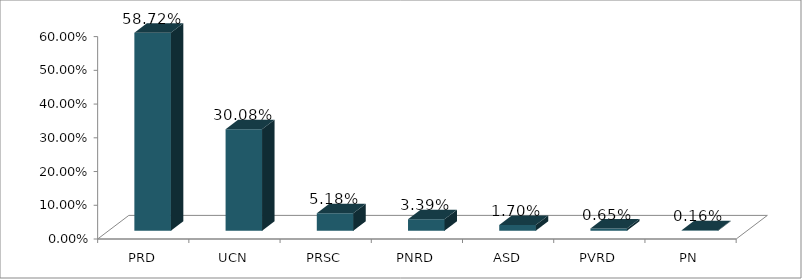
| Category | Votos % |
|---|---|
| PRD | 0.587 |
| UCN | 0.301 |
| PRSC | 0.052 |
| PNRD | 0.034 |
| ASD | 0.017 |
| PVRD | 0.007 |
| PN | 0.002 |